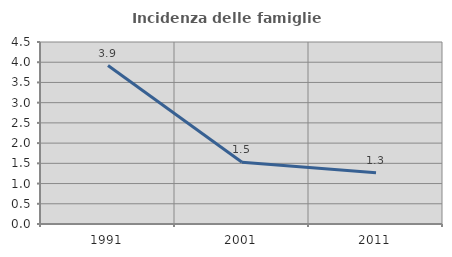
| Category | Incidenza delle famiglie numerose |
|---|---|
| 1991.0 | 3.919 |
| 2001.0 | 1.528 |
| 2011.0 | 1.266 |